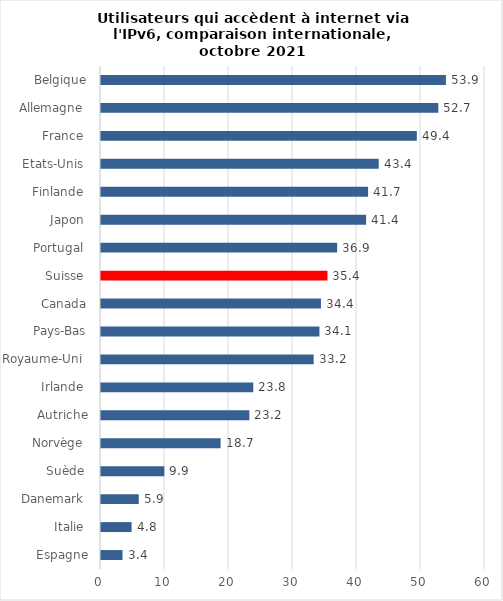
| Category | Series 0 |
|---|---|
| Espagne | 3.36 |
| Italie  | 4.78 |
| Danemark  | 5.9 |
| Suède  | 9.89 |
| Norvège  | 18.69 |
| Autriche | 23.18 |
| Irlande  | 23.79 |
| Royaume-Uni  | 33.23 |
| Pays-Bas | 34.13 |
| Canada | 34.37 |
| Suisse  | 35.39 |
| Portugal  | 36.9 |
| Japon  | 41.42 |
| Finlande  | 41.73 |
| Etats-Unis  | 43.39 |
| France  | 49.35 |
| Allemagne  | 52.71 |
| Belgique | 53.89 |